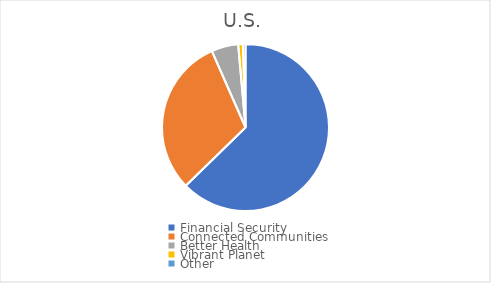
| Category | Series 0 |
|---|---|
| Financial Security | 62.7 |
| Connected Communities | 30.7 |
| Better Health | 5.2 |
| Vibrant Planet | 0.9 |
| Other | 0.5 |